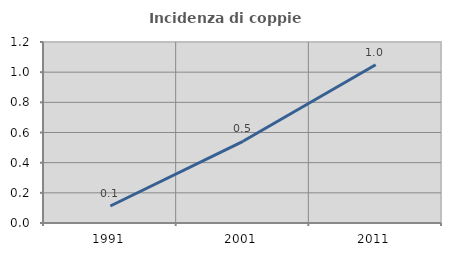
| Category | Incidenza di coppie miste |
|---|---|
| 1991.0 | 0.113 |
| 2001.0 | 0.542 |
| 2011.0 | 1.049 |